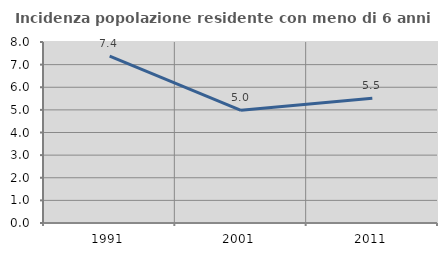
| Category | Incidenza popolazione residente con meno di 6 anni |
|---|---|
| 1991.0 | 7.377 |
| 2001.0 | 4.981 |
| 2011.0 | 5.514 |